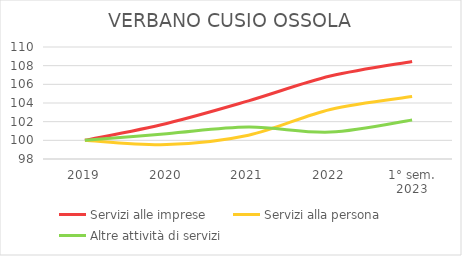
| Category | Servizi alle imprese | Servizi alla persona | Altre attività di servizi |
|---|---|---|---|
| 2019 | 100 | 100 | 100 |
| 2020 | 101.812 | 99.54 | 100.708 |
| 2021 | 104.227 | 100.551 | 101.416 |
| 2022 | 106.884 | 103.309 | 100.885 |
| 1° sem.
2023 | 108.454 | 104.688 | 102.183 |